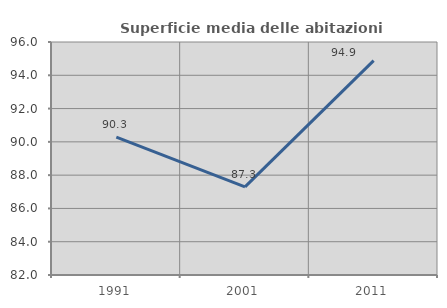
| Category | Superficie media delle abitazioni occupate |
|---|---|
| 1991.0 | 90.283 |
| 2001.0 | 87.296 |
| 2011.0 | 94.88 |